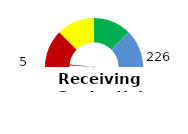
| Category | Series 1 |
|---|---|
| 0 | 2.212 |
| 1 | 1 |
| 2 | 196.788 |